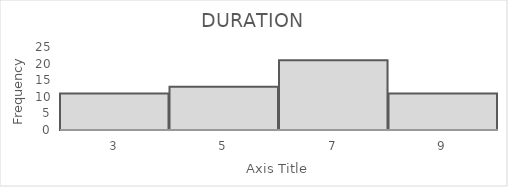
| Category | Frequency |
|---|---|
| 3.0 | 11 |
| 5.0 | 13 |
| 7.0 | 21 |
| 9.0 | 11 |